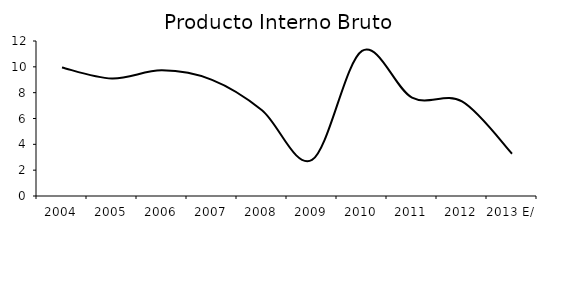
| Category | Producto Interno Bruto a precios de mercado E/ |
|---|---|
| 2004 | 9.945 |
| 2005 | 9.093 |
| 2006 | 9.726 |
| 2007 | 8.992 |
| 2008 | 6.643 |
| 2009 | 2.788 |
| 2010 | 11.235 |
| 2011 | 7.622 |
| 2012 | 7.318 |
| 2013 E/ | 3.272 |